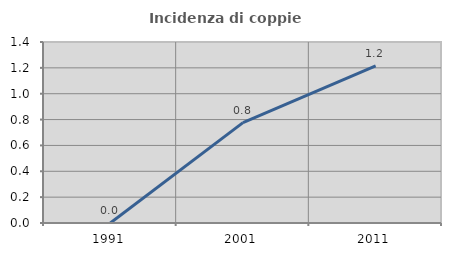
| Category | Incidenza di coppie miste |
|---|---|
| 1991.0 | 0 |
| 2001.0 | 0.776 |
| 2011.0 | 1.215 |